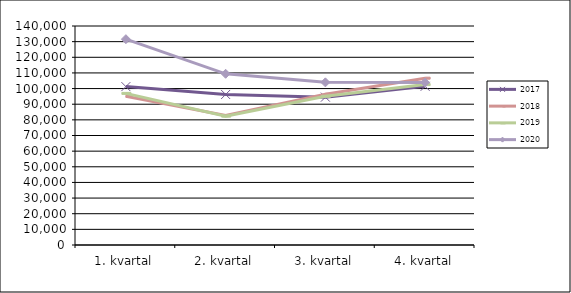
| Category | 2017 | 2018 | 2019 | 2020 |
|---|---|---|---|---|
| 1. kvartal | 101262 | 95094 | 96916 | 131576 |
| 2. kvartal | 96227 | 82744 | 82376 | 109447 |
| 3. kvartal | 94518 | 96350 | 95064 | 103971 |
| 4. kvartal | 101438 | 106644 | 102553 | 103850 |